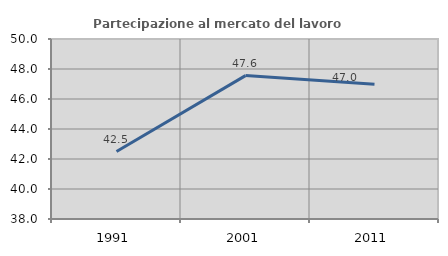
| Category | Partecipazione al mercato del lavoro  femminile |
|---|---|
| 1991.0 | 42.5 |
| 2001.0 | 47.561 |
| 2011.0 | 46.983 |